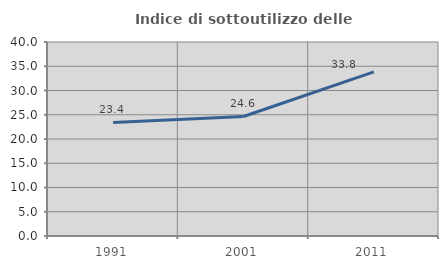
| Category | Indice di sottoutilizzo delle abitazioni  |
|---|---|
| 1991.0 | 23.408 |
| 2001.0 | 24.64 |
| 2011.0 | 33.828 |